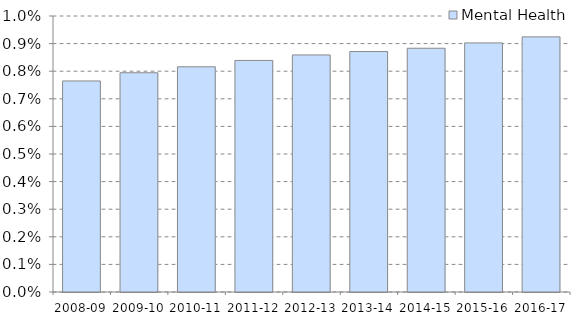
| Category | Mental Health |
|---|---|
| 2008-09 | 0.008 |
| 2009-10 | 0.008 |
| 2010-11 | 0.008 |
| 2011-12 | 0.008 |
| 2012-13 | 0.009 |
| 2013-14 | 0.009 |
| 2014-15 | 0.009 |
| 2015-16 | 0.009 |
| 2016-17 | 0.009 |